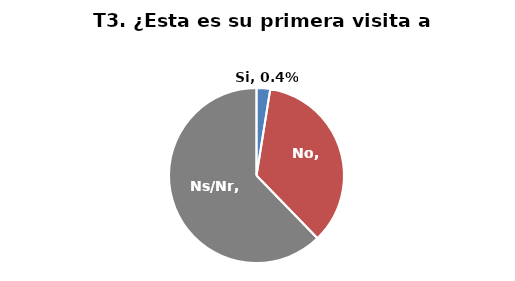
| Category | Series 0 |
|---|---|
| Si | 0.004 |
| No | 0.06 |
| Ns/Nr | 0.107 |